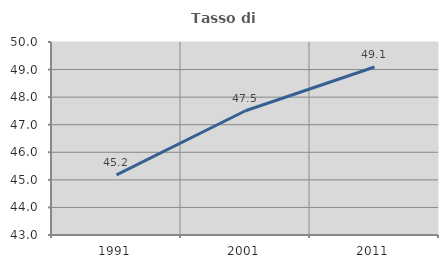
| Category | Tasso di occupazione   |
|---|---|
| 1991.0 | 45.179 |
| 2001.0 | 47.507 |
| 2011.0 | 49.092 |